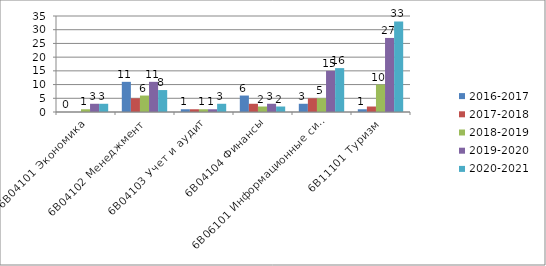
| Category | 2016-2017 | 2017-2018 | 2018-2019 | 2019-2020 | 2020-2021 |
|---|---|---|---|---|---|
| _x0011_6В04101 Экономика | 0 | 0 | 1 | 3 | 3 |
| _x0012_6В04102 Менеджмент | 11 | 5 | 6 | 11 | 8 |
| _x0014_6В04103 Учет и аудит | 1 | 1 | 1 | 1 | 3 |
| _x000f_6В04104 Финансы | 6 | 3 | 2 | 3 | 2 |
| _x001e_6В06101 Информационные системы | 3 | 5 | 5 | 15 | 16 |
| _x000e_6В11101 Туризм | 1 | 2 | 10 | 27 | 33 |